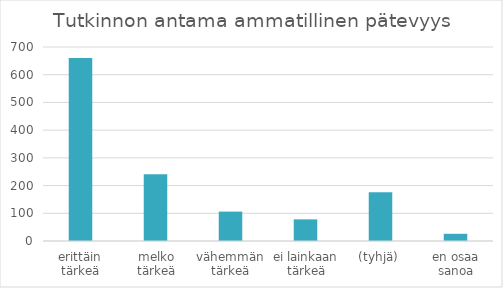
| Category | Summa |
|---|---|
| erittäin tärkeä | 660 |
| melko tärkeä | 241 |
| vähemmän tärkeä | 106 |
| ei lainkaan tärkeä | 78 |
| (tyhjä) | 176 |
| en osaa sanoa | 26 |